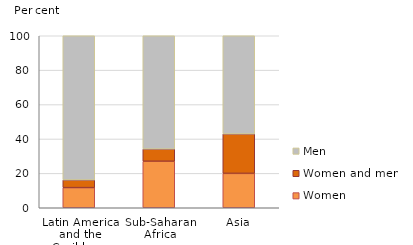
| Category | Women | Women and men | Men |
|---|---|---|---|
| Latin America and the Caribbean | 11.7 | 4.48 | 83.82 |
| Sub-Saharan Africa | 27.04 | 7.11 | 65.85 |
| Asia | 19.98 | 22.97 | 57.05 |